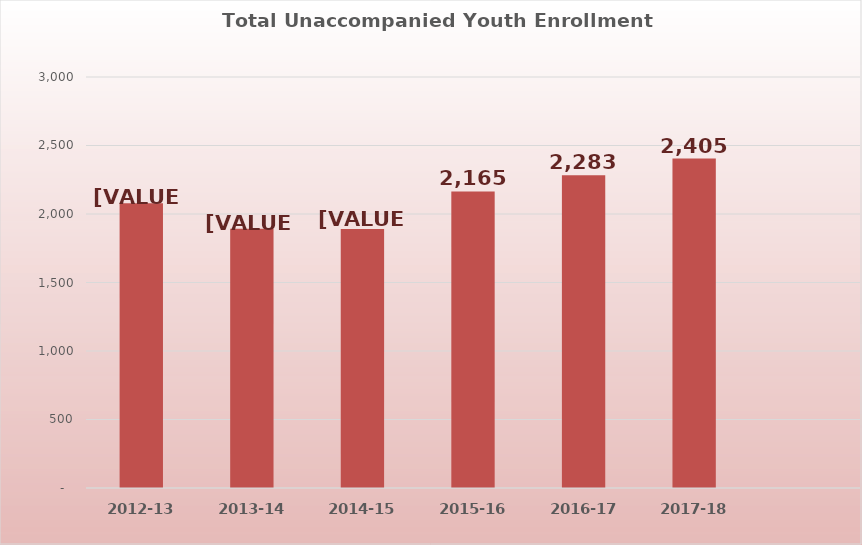
| Category | Unaccompanied Youth |
|---|---|
| 2012-13 | 2078 |
| 2013-14 | 1892 |
| 2014-15 | 1891 |
| 2015-16 | 2165 |
| 2016-17 | 2283 |
| 2017-18 | 2405 |